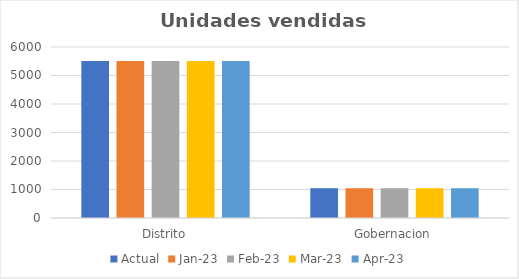
| Category | Actual | ene-23 | feb-23 | mar-23 | abr-23 |
|---|---|---|---|---|---|
| Distrito | 5507 | 5507 | 5507 | 5507 | 5507 |
| Gobernacion | 1045 | 1045 | 1045 | 1045 | 1045 |